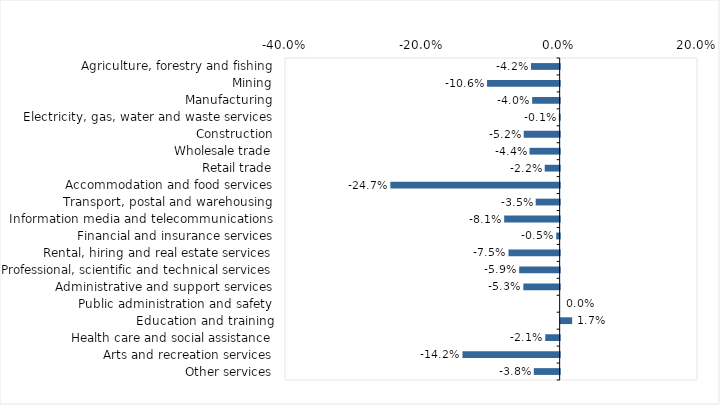
| Category | This week |
|---|---|
| Agriculture, forestry and fishing | -0.042 |
| Mining | -0.106 |
| Manufacturing | -0.04 |
| Electricity, gas, water and waste services | -0.001 |
| Construction | -0.052 |
| Wholesale trade | -0.044 |
| Retail trade | -0.022 |
| Accommodation and food services | -0.247 |
| Transport, postal and warehousing | -0.035 |
| Information media and telecommunications | -0.081 |
| Financial and insurance services | -0.005 |
| Rental, hiring and real estate services | -0.075 |
| Professional, scientific and technical services | -0.059 |
| Administrative and support services | -0.053 |
| Public administration and safety | 0 |
| Education and training | 0.017 |
| Health care and social assistance | -0.021 |
| Arts and recreation services | -0.142 |
| Other services | -0.038 |